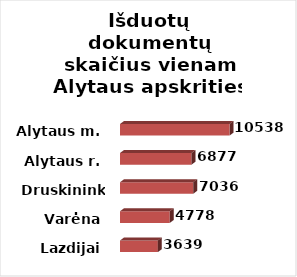
| Category | Series 0 |
|---|---|
| Lazdijai | 3639 |
| Varėna | 4778 |
| Druskininkai | 7036 |
| Alytaus r. | 6877 |
| Alytaus m. | 10538 |